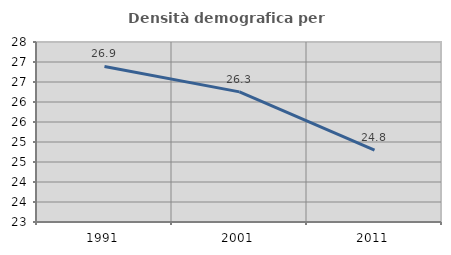
| Category | Densità demografica |
|---|---|
| 1991.0 | 26.89 |
| 2001.0 | 26.253 |
| 2011.0 | 24.797 |